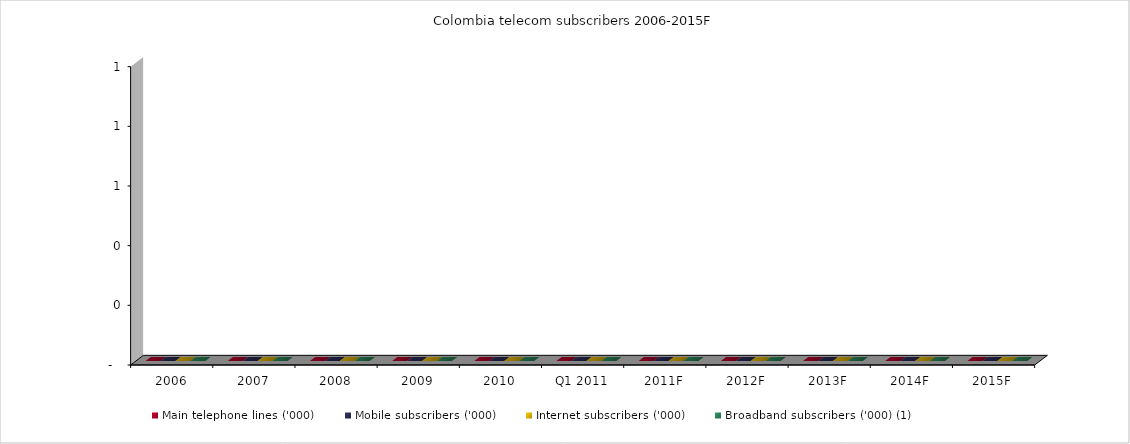
| Category | Main telephone lines ('000) | Mobile subscribers ('000) | Internet subscribers ('000) | Broadband subscribers ('000) (1) |
|---|---|---|---|---|
| 2006 | 0 | 0 | 0 | 0 |
| 2007 | 0 | 0 | 0 | 0 |
| 2008 | 0 | 0 | 0 | 0 |
| 2009 | 0 | 0 | 0 | 0 |
| 2010 | 0 | 0 | 0 | 0 |
| Q1 2011 | 0 | 0 | 0 | 0 |
| 2011F | 0 | 0 | 0 | 0 |
| 2012F | 0 | 0 | 0 | 0 |
| 2013F | 0 | 0 | 0 | 0 |
| 2014F | 0 | 0 | 0 | 0 |
| 2015F | 0 | 0 | 0 | 0 |